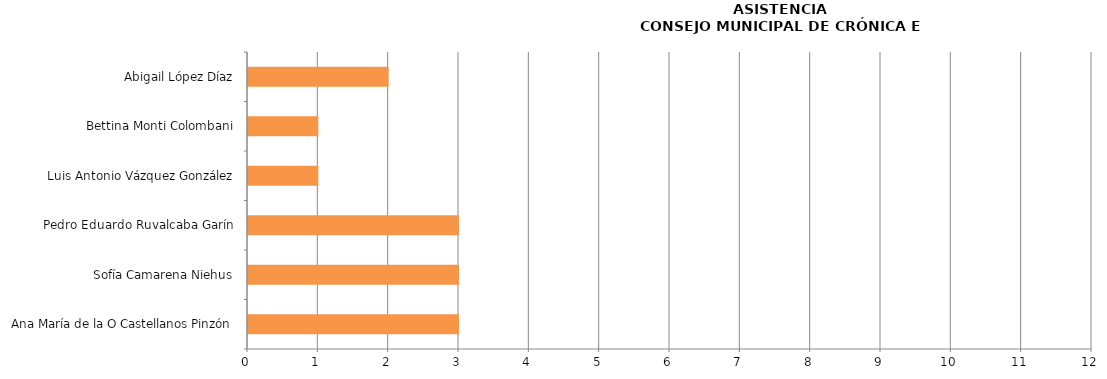
| Category | Series 0 |
|---|---|
| Ana María de la O Castellanos Pinzón | 3 |
| Sofía Camarena Niehus | 3 |
| Pedro Eduardo Ruvalcaba Garín | 3 |
| Luis Antonio Vázquez González | 1 |
| Bettina Monti Colombani | 1 |
| Abigail López Díaz | 2 |